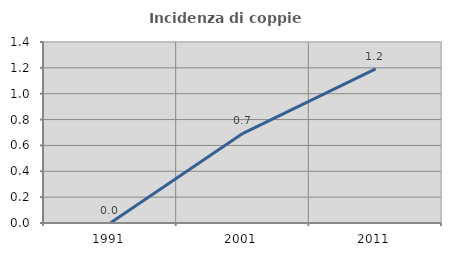
| Category | Incidenza di coppie miste |
|---|---|
| 1991.0 | 0 |
| 2001.0 | 0.694 |
| 2011.0 | 1.191 |